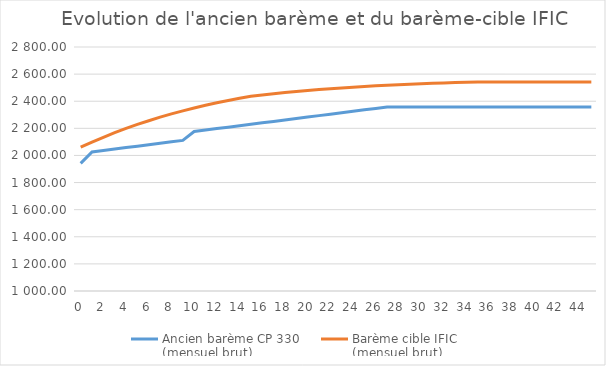
| Category | Ancien barème CP 330 
(mensuel brut) | Barème cible | Barème cible IFIC 
(mensuel brut) |
|---|---|---|---|
| 0.0 | 1941.79 |  | 2060.66 |
| 1.0 | 2026.07 |  | 2098.47 |
| 2.0 | 2036.72 |  | 2134.08 |
| 3.0 | 2047.36 |  | 2167.58 |
| 4.0 | 2058 |  | 2199.06 |
| 5.0 | 2068.64 |  | 2228.6 |
| 6.0 | 2079.28 |  | 2256.28 |
| 7.0 | 2089.93 |  | 2282.21 |
| 8.0 | 2100.57 |  | 2306.46 |
| 9.0 | 2111.21 |  | 2329.14 |
| 10.0 | 2176.74 |  | 2350.32 |
| 11.0 | 2187.38 |  | 2370.1 |
| 12.0 | 2198.02 |  | 2388.53 |
| 13.0 | 2208.67 |  | 2405.72 |
| 14.0 | 2219.31 |  | 2421.74 |
| 15.0 | 2229.95 |  | 2436.66 |
| 16.0 | 2240.59 |  | 2446.52 |
| 17.0 | 2251.24 |  | 2455.67 |
| 18.0 | 2261.88 |  | 2464.17 |
| 19.0 | 2272.52 |  | 2472.06 |
| 20.0 | 2283.17 |  | 2479.39 |
| 21.0 | 2293.81 |  | 2486.18 |
| 22.0 | 2304.45 |  | 2492.47 |
| 23.0 | 2315.09 |  | 2498.32 |
| 24.0 | 2325.74 |  | 2503.74 |
| 25.0 | 2336.38 |  | 2508.77 |
| 26.0 | 2347.02 |  | 2513.42 |
| 27.0 | 2357.67 |  | 2517.73 |
| 28.0 | 2357.67 |  | 2521.73 |
| 29.0 | 2357.67 |  | 2525.43 |
| 30.0 | 2357.67 |  | 2528.87 |
| 31.0 | 2357.67 |  | 2532.04 |
| 32.0 | 2357.67 |  | 2534.98 |
| 33.0 | 2357.67 |  | 2537.71 |
| 34.0 | 2357.67 |  | 2540.23 |
| 35.0 | 2357.67 |  | 2542.57 |
| 36.0 | 2357.67 |  | 2542.57 |
| 37.0 | 2357.67 |  | 2542.57 |
| 38.0 | 2357.67 |  | 2542.57 |
| 39.0 | 2357.67 |  | 2542.57 |
| 40.0 | 2357.67 |  | 2542.57 |
| 41.0 | 2357.67 |  | 2542.57 |
| 42.0 | 2357.67 |  | 2542.57 |
| 43.0 | 2357.67 |  | 2542.57 |
| 44.0 | 2357.67 |  | 2542.57 |
| 45.0 | 2357.67 |  | 2542.57 |